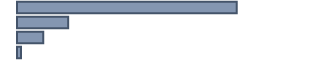
| Category | Series 0 |
|---|---|
| 0 | 73 |
| 1 | 17 |
| 2 | 8.7 |
| 3 | 1.3 |